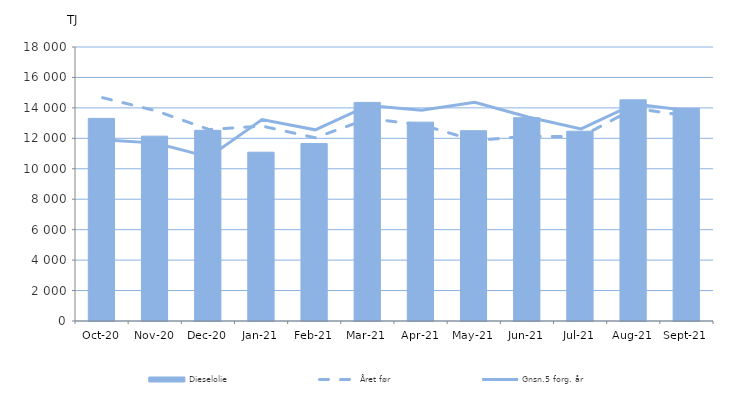
| Category | Dieselolie |
|---|---|
| 2020-10-01 | 13311.009 |
| 2020-11-01 | 12143.685 |
| 2020-12-01 | 12525.536 |
| 2021-01-01 | 11089.561 |
| 2021-02-01 | 11657.208 |
| 2021-03-01 | 14359.861 |
| 2021-04-01 | 13064.309 |
| 2021-05-01 | 12502.867 |
| 2021-06-01 | 13356.741 |
| 2021-07-01 | 12469.367 |
| 2021-08-01 | 14528.513 |
| 2021-09-01 | 13974.424 |